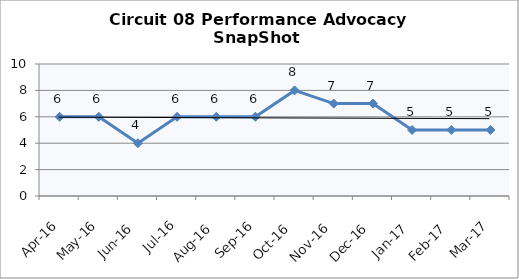
| Category | Circuit 08 |
|---|---|
| Apr-16 | 6 |
| May-16 | 6 |
| Jun-16 | 4 |
| Jul-16 | 6 |
| Aug-16 | 6 |
| Sep-16 | 6 |
| Oct-16 | 8 |
| Nov-16 | 7 |
| Dec-16 | 7 |
| Jan-17 | 5 |
| Feb-17 | 5 |
| Mar-17 | 5 |